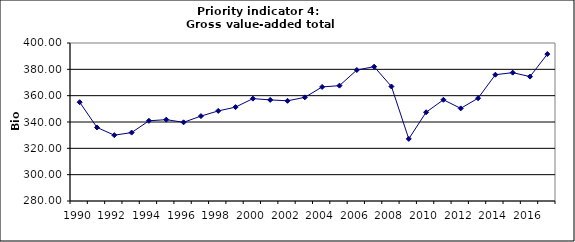
| Category | Gross value-added total industry, Bio Euro (EC95) |
|---|---|
| 1990 | 355.04 |
| 1991 | 335.868 |
| 1992 | 329.997 |
| 1993 | 331.965 |
| 1994 | 340.908 |
| 1995 | 341.787 |
| 1996 | 339.762 |
| 1997 | 344.487 |
| 1998 | 348.413 |
| 1999 | 351.3 |
| 2000 | 357.759 |
| 2001 | 356.787 |
| 2002 | 356.094 |
| 2003 | 358.718 |
| 2004 | 366.635 |
| 2005 | 367.609 |
| 2006 | 379.483 |
| 2007 | 382.017 |
| 2008 | 366.975 |
| 2009 | 327.171 |
| 2010 | 347.392 |
| 2011 | 356.877 |
| 2012 | 350.344 |
| 2013 | 358.063 |
| 2014 | 375.915 |
| 2015 | 377.483 |
| 2016 | 374.485 |
| 2017 | 391.579 |